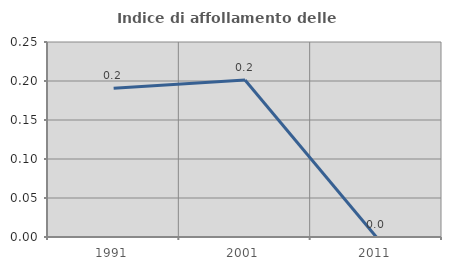
| Category | Indice di affollamento delle abitazioni  |
|---|---|
| 1991.0 | 0.191 |
| 2001.0 | 0.201 |
| 2011.0 | 0 |